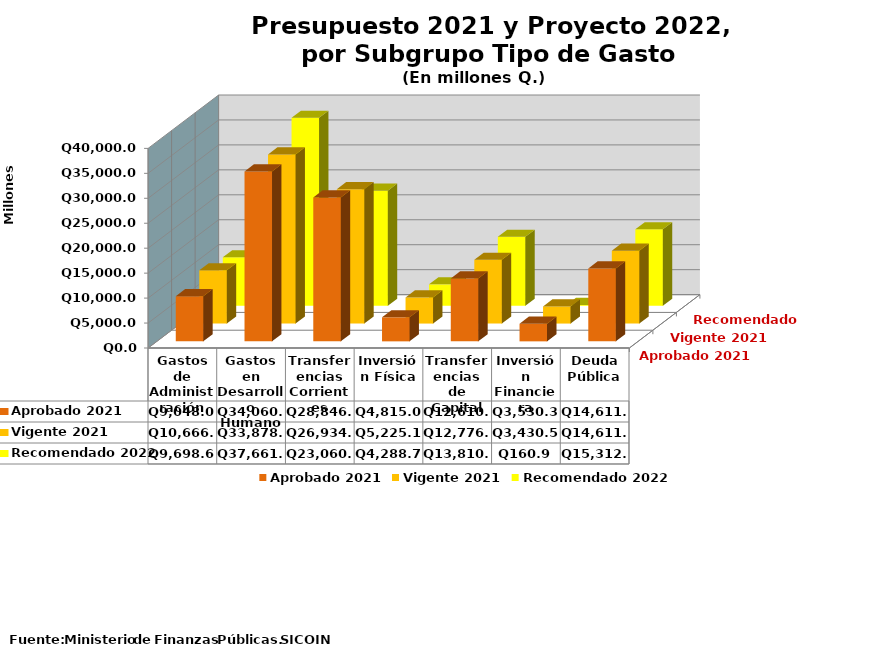
| Category | Aprobado 2021 | Vigente 2021 | Recomendado 2022 |
|---|---|---|---|
| Gastos de Administración | 9048 | 10666 | 9698.6 |
| Gastos en Desarrollo Humano | 34060.9 | 33878.5 | 37661.2 |
| Transferencias Corrientes | 28846.3 | 26934.1 | 23060.2 |
| Inversión Física | 4815 | 5225.1 | 4288.7 |
| Transferencias de Capital | 12610 | 12776.3 | 13810.9 |
| Inversión Financiera | 3530.3 | 3430.5 | 160.9 |
| Deuda Pública | 14611 | 14611 | 15312 |